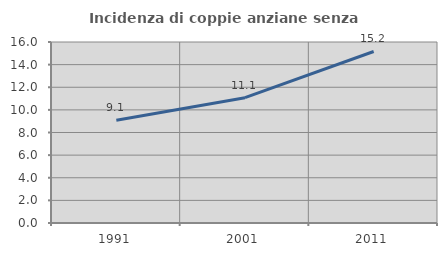
| Category | Incidenza di coppie anziane senza figli  |
|---|---|
| 1991.0 | 9.091 |
| 2001.0 | 11.08 |
| 2011.0 | 15.16 |